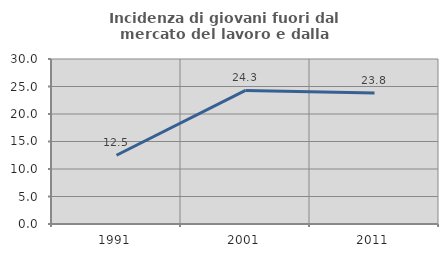
| Category | Incidenza di giovani fuori dal mercato del lavoro e dalla formazione  |
|---|---|
| 1991.0 | 12.5 |
| 2001.0 | 24.286 |
| 2011.0 | 23.81 |